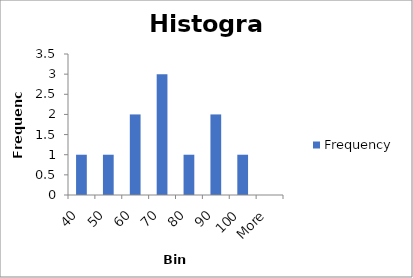
| Category | Frequency |
|---|---|
| 40 | 1 |
| 50 | 1 |
| 60 | 2 |
| 70 | 3 |
| 80 | 1 |
| 90 | 2 |
| 100 | 1 |
| More | 0 |